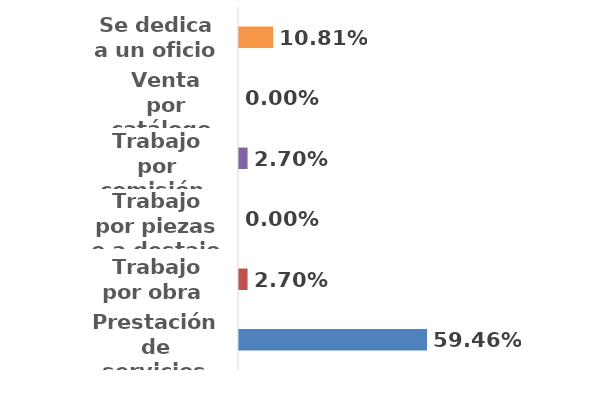
| Category | Series 0 |
|---|---|
| Prestación de servicios | 0.595 |
| Trabajo por obra  | 0.027 |
| Trabajo por piezas o a destajo  | 0 |
| Trabajo por comisión  | 0.027 |
| Venta por catálogo  | 0 |
| Se dedica a un oficio | 0.108 |